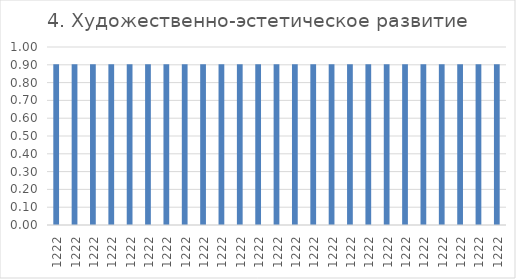
| Category | Series 0 |
|---|---|
| 1222.0 | 0.903 |
| 1222.0 | 0.903 |
| 1222.0 | 0.903 |
| 1222.0 | 0.903 |
| 1222.0 | 0.903 |
| 1222.0 | 0.903 |
| 1222.0 | 0.903 |
| 1222.0 | 0.903 |
| 1222.0 | 0.903 |
| 1222.0 | 0.903 |
| 1222.0 | 0.903 |
| 1222.0 | 0.903 |
| 1222.0 | 0.903 |
| 1222.0 | 0.903 |
| 1222.0 | 0.903 |
| 1222.0 | 0.903 |
| 1222.0 | 0.903 |
| 1222.0 | 0.903 |
| 1222.0 | 0.903 |
| 1222.0 | 0.903 |
| 1222.0 | 0.903 |
| 1222.0 | 0.903 |
| 1222.0 | 0.903 |
| 1222.0 | 0.903 |
| 1222.0 | 0.903 |